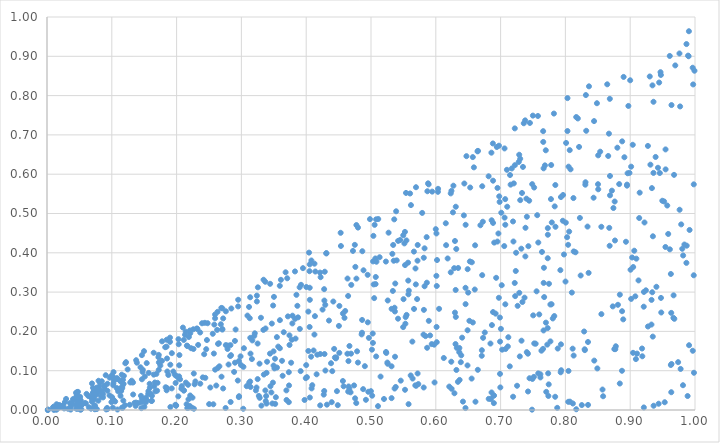
| Category | Series 0 |
|---|---|
| 0.3346108674601953 | 0.09 |
| 0.05352242350241687 | 0.014 |
| 0.5534597976284928 | 0.236 |
| 0.5317183482084774 | 0.111 |
| 0.1903210896777161 | 0.115 |
| 0.33089036839729535 | 0.011 |
| 0.8688505103767908 | 0.546 |
| 0.7452546820998992 | 0.73 |
| 0.06917112646794843 | 0.021 |
| 0.2756167941514921 | 0.005 |
| 0.6440267286544568 | 0.576 |
| 0.7379051768808673 | 0.737 |
| 0.7638807591230342 | 0.402 |
| 0.7767996350791615 | 0.268 |
| 0.4750461932757427 | 0.42 |
| 0.7728488679648859 | 0.463 |
| 0.8764765675516968 | 0.431 |
| 0.36099183500792764 | 0.331 |
| 0.21404311870427417 | 0.199 |
| 0.7503273426919902 | 0.241 |
| 0.7076103797195853 | 0.155 |
| 0.28874953400416126 | 0.097 |
| 0.7102221696329708 | 0.517 |
| 0.48554497341873804 | 0.192 |
| 0.40000535338526166 | 0.114 |
| 0.14502385615050828 | 0.036 |
| 0.10801182653357566 | 0.081 |
| 0.08887011389820587 | 0.061 |
| 0.5525502741835562 | 0.369 |
| 0.2759823668447141 | 0.165 |
| 0.6984901692536842 | 0.529 |
| 0.3135005705194994 | 0.072 |
| 0.5448834085459722 | 0.433 |
| 0.3254471000695862 | 0.312 |
| 0.5364431527887821 | 0.055 |
| 0.5026529940240385 | 0.195 |
| 0.18980605247481352 | 0.173 |
| 0.2520189142857697 | 0.057 |
| 0.5229774536222315 | 0.378 |
| 0.7720877123474915 | 0.166 |
| 0.6815310873353209 | 0.595 |
| 0.3140698255886434 | 0.143 |
| 0.25668766766772366 | 0.015 |
| 0.807969169061331 | 0.612 |
| 0.8348644246009912 | 0.173 |
| 0.42863525859736384 | 0.352 |
| 0.7357933734504685 | 0.73 |
| 0.6014857508311492 | 0.316 |
| 0.6295805628481282 | 0.43 |
| 0.4127074046963689 | 0.192 |
| 0.8687974933848747 | 0.595 |
| 0.016193580050385403 | 0.003 |
| 0.7734061494011968 | 0.093 |
| 0.8223721792858856 | 0.489 |
| 0.693147044667837 | 0.336 |
| 0.2693339442553647 | 0.085 |
| 0.24789275377386466 | 0.221 |
| 0.3396074651293717 | 0.123 |
| 0.1329568423176004 | 0.039 |
| 0.6241386443175346 | 0.558 |
| 0.9971828159755123 | 0.828 |
| 0.698943614575877 | 0.235 |
| 0.7555310068969805 | 0.302 |
| 0.9495555914309505 | 0.532 |
| 0.66439674406568 | 0.658 |
| 0.35320405201272886 | 0.033 |
| 0.5318162392922988 | 0.257 |
| 0.04763531543346444 | 0.016 |
| 0.9139381554840821 | 0.488 |
| 0.5662200003032491 | 0.403 |
| 0.16879869147976856 | 0.092 |
| 0.4601823043992782 | 0.252 |
| 0.15395891471243783 | 0.025 |
| 0.08839976914608849 | 0.061 |
| 0.8503079732271913 | 0.575 |
| 0.060035234266528015 | 0.017 |
| 0.9637316013801825 | 0.776 |
| 0.20389268005652916 | 0.086 |
| 0.9983906198800435 | 0.095 |
| 0.1846596538501677 | 0.05 |
| 0.7576030530566901 | 0.748 |
| 0.504902317282808 | 0.285 |
| 0.12849740909507212 | 0.07 |
| 0.3767345171277898 | 0.12 |
| 0.19042410293573497 | 0.008 |
| 0.9340331604435197 | 0.3 |
| 0.6978968799988595 | 0.544 |
| 0.9348439020989773 | 0.187 |
| 0.18571148756945755 | 0.098 |
| 0.9586694091960357 | 0.448 |
| 0.8898568319406016 | 0.848 |
| 0.8044204465735395 | 0.021 |
| 0.18452103582684065 | 0.161 |
| 0.6050641351763347 | 0.257 |
| 0.6419111249500232 | 0.021 |
| 0.5579963890541367 | 0.015 |
| 0.04698793316015737 | 0.013 |
| 0.31403259321766686 | 0.059 |
| 0.01779842356155792 | 0.01 |
| 0.12771209080975632 | 0.013 |
| 0.06101372591285115 | 0.041 |
| 0.4311469771108004 | 0.398 |
| 0.33759004283976013 | 0.023 |
| 0.21110312939465692 | 0.178 |
| 0.17740730206572575 | 0.125 |
| 0.586619256022279 | 0.158 |
| 0.19722674297732423 | 0.09 |
| 0.07951650747205918 | 0.074 |
| 0.13277120982577084 | 0.07 |
| 0.40561892542504274 | 0.28 |
| 0.2901183885171108 | 0.12 |
| 0.03237670098469325 | 0.003 |
| 0.545909435913267 | 0.075 |
| 0.6709217431536874 | 0.138 |
| 0.9242327263661472 | 0.305 |
| 0.03657654509042607 | 0.001 |
| 0.6123339965580286 | 0.132 |
| 0.8874575709243631 | 0.251 |
| 0.7119147092910484 | 0.185 |
| 0.5496426736973106 | 0.211 |
| 0.7191590135716516 | 0.48 |
| 0.8111804608546319 | 0.156 |
| 0.22672782822487325 | 0.003 |
| 0.05834147562303327 | 0.018 |
| 0.4635692268523869 | 0.143 |
| 0.4775147646395327 | 0.334 |
| 0.4738921275811693 | 0.063 |
| 0.16994959409797616 | 0.049 |
| 0.06460776801639412 | 0.007 |
| 0.3039149127324404 | 0.157 |
| 0.8210879840684617 | 0.669 |
| 0.2625422366803255 | 0.204 |
| 0.7072884242140443 | 0.269 |
| 0.24570359567641342 | 0.155 |
| 0.283985727817767 | 0.139 |
| 0.04479932886188531 | 0.044 |
| 0.08453218717133237 | 0.073 |
| 0.7446626607208486 | 0.081 |
| 0.8777915084539658 | 0.162 |
| 0.4310153925666711 | 0.399 |
| 0.523173517713173 | 0.148 |
| 0.11775899285279612 | 0.024 |
| 0.11672905821339397 | 0.005 |
| 0.734518777658452 | 0.619 |
| 0.4075836271201221 | 0.136 |
| 0.10341135404660717 | 0.075 |
| 0.10251548363526808 | 0.068 |
| 0.09273866786664275 | 0.005 |
| 0.1706177101041928 | 0.069 |
| 0.04015244075538871 | 0.028 |
| 0.874091006845517 | 0.514 |
| 0.5530733983445877 | 0.22 |
| 0.5502090642672399 | 0.282 |
| 0.8554578828078264 | 0.466 |
| 0.7737183199681025 | 0.036 |
| 0.7746631404606942 | 0.321 |
| 0.150743413433579 | 0.028 |
| 0.04507094080891272 | 0.003 |
| 0.11614062248875578 | 0.056 |
| 0.0679297757649866 | 0.003 |
| 0.3233414363651771 | 0.057 |
| 0.5337368113404856 | 0.303 |
| 0.16197024735877152 | 0.036 |
| 0.9457037392064594 | 0.603 |
| 0.203265926667886 | 0.167 |
| 0.2718186403412032 | 0.055 |
| 0.9046007133234849 | 0.364 |
| 0.38358663634354107 | 0.182 |
| 0.9128401970803447 | 0.33 |
| 0.99920308042453 | 0.863 |
| 0.29638901264533735 | 0.035 |
| 0.9078890120466971 | 0.289 |
| 0.14971670626120992 | 0.15 |
| 0.21768746296583597 | 0.064 |
| 0.7742627253252317 | 0.065 |
| 0.5070735840257541 | 0.32 |
| 0.7777317197918483 | 0.537 |
| 0.22099862744260468 | 0.037 |
| 0.1474764860891874 | 0.097 |
| 0.8235860808380364 | 0.342 |
| 0.2443185872404352 | 0.082 |
| 0.10271200658387736 | 0.096 |
| 0.21652478704551958 | 0.005 |
| 0.07410963243889568 | 0.011 |
| 0.09321027799422998 | 0.067 |
| 0.11447066562209773 | 0.048 |
| 0.6019227755371487 | 0.382 |
| 0.09644682726922427 | 0.037 |
| 0.8167060353222642 | 0.745 |
| 0.3549011173519794 | 0.108 |
| 0.525252181947084 | 0.121 |
| 0.9676778185375495 | 0.598 |
| 0.5663919293598269 | 0.257 |
| 0.039176853437448145 | 0.018 |
| 0.3950000344198993 | 0.361 |
| 0.5891937886310323 | 0.227 |
| 0.706168432765699 | 0.489 |
| 0.1478123525470394 | 0.102 |
| 0.7658145639106968 | 0.682 |
| 0.48617430702655584 | 0.197 |
| 0.2260596129921797 | 0.155 |
| 0.45046973584953276 | 0.214 |
| 0.428271566284646 | 0.142 |
| 0.2690455599948076 | 0.26 |
| 0.6458687305571571 | 0.311 |
| 0.029478461435804126 | 0.028 |
| 0.7336804439738099 | 0.275 |
| 0.5317653371916797 | 0.03 |
| 0.8999677709181403 | 0.839 |
| 0.13089121690823435 | 0.071 |
| 0.6974750298444514 | 0.673 |
| 0.5612726444771213 | 0.088 |
| 0.2631846939134942 | 0.25 |
| 0.4905234352871559 | 0.112 |
| 0.6208132492756525 | 0.06 |
| 0.9545559489248203 | 0.663 |
| 0.3238575979781577 | 0.291 |
| 0.7141564107484991 | 0.111 |
| 0.6344825359941587 | 0.361 |
| 0.27053546544478735 | 0.206 |
| 0.966964943687408 | 0.292 |
| 0.10154221983539002 | 0.084 |
| 0.7296304700446326 | 0.136 |
| 0.7072537657187722 | 0.471 |
| 0.7218081560722641 | 0.323 |
| 0.6861742689058107 | 0.483 |
| 0.7519177846335513 | 0.169 |
| 0.2682455354364919 | 0.218 |
| 0.29604115610414605 | 0.033 |
| 0.09992048177773816 | 0.088 |
| 0.6990861175731197 | 0.092 |
| 0.34412351194567925 | 0.143 |
| 0.6011928657225452 | 0.211 |
| 0.6755576430796074 | 0.197 |
| 0.8289075652812822 | 0.2 |
| 0.4056473633897554 | 0.032 |
| 0.14110797231383287 | 0.018 |
| 0.8127350292739425 | 0.138 |
| 0.8676890878614224 | 0.463 |
| 0.983660507419022 | 0.421 |
| 0.6304297182086346 | 0.168 |
| 0.096650987943258 | 0.082 |
| 0.623049500077229 | 0.551 |
| 0.4474500386209518 | 0.048 |
| 0.895981784477592 | 0.602 |
| 0.35186397197595576 | 0.13 |
| 0.9908409575390604 | 0.165 |
| 0.7805126417309334 | 0.233 |
| 0.8581988060390584 | 0.035 |
| 0.6458163842963545 | 0.005 |
| 0.7203728926946875 | 0.577 |
| 0.6571095300439564 | 0.644 |
| 0.598086354549956 | 0.07 |
| 0.7541039731203554 | 0.169 |
| 0.8971964150835033 | 0.774 |
| 0.6432877913501014 | 0.495 |
| 0.11448384744951101 | 0.072 |
| 0.403315652982965 | 0.15 |
| 0.5602829593432465 | 0.551 |
| 0.5616627395757675 | 0.521 |
| 0.2706012302140103 | 0.205 |
| 0.9335148358610847 | 0.565 |
| 0.5870051935862495 | 0.557 |
| 0.336835898065159 | 0.326 |
| 0.477474650958989 | 0.471 |
| 0.689419985829239 | 0.037 |
| 0.4393873959125665 | 0.02 |
| 0.8486747273831797 | 0.781 |
| 0.6014745821248263 | 0.173 |
| 0.199263226064607 | 0.012 |
| 0.7487934654692651 | 0.575 |
| 0.18522700973614592 | 0.131 |
| 0.19806092517164076 | 0.013 |
| 0.7844718445140593 | 0.572 |
| 0.14428745620870176 | 0.109 |
| 0.11538020539961769 | 0.09 |
| 0.5858865859655162 | 0.44 |
| 0.7596565223827024 | 0.243 |
| 0.5729942967875739 | 0.066 |
| 0.1022977706478354 | 0.063 |
| 0.5374422879906802 | 0.322 |
| 0.3387969383101802 | 0.016 |
| 0.6843486094455709 | 0.169 |
| 0.3339384351467517 | 0.204 |
| 0.28019047782109996 | 0.116 |
| 0.9350433145427061 | 0.442 |
| 0.3653599698157345 | 0.198 |
| 0.30935718300790704 | 0.24 |
| 0.7070802943998075 | 0.537 |
| 0.6159307453479878 | 0.419 |
| 0.4721599709122559 | 0.405 |
| 0.7172650077655861 | 0.615 |
| 0.5370692516568552 | 0.135 |
| 0.42804060286588086 | 0.278 |
| 0.1719439766343085 | 0.134 |
| 0.20262040533656855 | 0.035 |
| 0.23654592318129608 | 0.067 |
| 0.014444040878316522 | 0.001 |
| 0.47546027878950503 | 0.03 |
| 0.31289259421881066 | 0.234 |
| 0.6729557988065795 | 0.184 |
| 0.2332467949643522 | 0.166 |
| 0.3731749409720553 | 0.02 |
| 0.19246850352601208 | 0.055 |
| 0.39746579731501397 | 0.026 |
| 0.7441064240499877 | 0.533 |
| 0.019571709144174165 | 0.008 |
| 0.11721402723689123 | 0.077 |
| 0.6816559635091938 | 0.028 |
| 0.6283762360871404 | 0.361 |
| 0.5546788150221155 | 0.432 |
| 0.27603708081276734 | 0.251 |
| 0.5523772183502219 | 0.453 |
| 0.9544011444639978 | 0.415 |
| 0.4054196343044393 | 0.311 |
| 0.503689546285895 | 0.443 |
| 0.2183318851779248 | 0.027 |
| 0.4083544439051625 | 0.055 |
| 0.5697424740907451 | 0.062 |
| 0.5694421941960282 | 0.567 |
| 0.3521601223919537 | 0.016 |
| 0.27859890442175517 | 0.155 |
| 0.6650822885297046 | 0.659 |
| 0.5571912524018551 | 0.375 |
| 0.38987429158277176 | 0.312 |
| 0.7630201157084854 | 0.151 |
| 0.5358625754752661 | 0.485 |
| 0.568648461279238 | 0.36 |
| 0.8026188434877682 | 0.44 |
| 0.6009947223761507 | 0.449 |
| 0.7010761963171656 | 0.502 |
| 0.9146384454310735 | 0.553 |
| 0.684908313006746 | 0.028 |
| 0.7319639852807629 | 0.41 |
| 0.048353539169850634 | 0.023 |
| 0.12085096720473176 | 0.119 |
| 0.9328033237519519 | 0.217 |
| 0.08373234181878442 | 0.034 |
| 0.5880981215959713 | 0.577 |
| 0.7288593522682508 | 0.298 |
| 0.15650127289282012 | 0.048 |
| 0.9473537389156222 | 0.852 |
| 0.6648371993307448 | 0.102 |
| 0.8555344944550406 | 0.244 |
| 0.4566363257974184 | 0.074 |
| 0.7704645044802227 | 0.046 |
| 0.7060712002306675 | 0.666 |
| 0.47992509881693524 | 0.464 |
| 0.2581998235079449 | 0.217 |
| 0.6715980140907564 | 0.343 |
| 0.2205238755078538 | 0.202 |
| 0.24679138918222487 | 0.178 |
| 0.17247066216435858 | 0.14 |
| 0.40529024937440017 | 0.211 |
| 0.7263094405035001 | 0.265 |
| 0.4319786691303532 | 0.014 |
| 0.01038389793696437 | 0.008 |
| 0.5514967044620632 | 0.424 |
| 0.04598232858869444 | 0.039 |
| 0.4462936064854077 | 0.134 |
| 0.696616544443875 | 0.449 |
| 0.830748699639343 | 0.573 |
| 0.8042010248188626 | 0.42 |
| 0.4296329383411873 | 0.1 |
| 0.8645499007292995 | 0.829 |
| 0.9211919735809885 | 0.3 |
| 0.4044008980264262 | 0.4 |
| 0.9633313794558009 | 0.247 |
| 0.9479404021478821 | 0.248 |
| 0.3717851834664089 | 0.238 |
| 0.07039904096595706 | 0.041 |
| 0.07680080414184431 | 0.057 |
| 0.3372815732108244 | 0.207 |
| 0.25937958524639526 | 0.233 |
| 0.025134400603229468 | 0.012 |
| 0.9906027117916839 | 0.964 |
| 0.49504742403126367 | 0.223 |
| 0.9981129618309935 | 0.574 |
| 0.3250444176544426 | 0.169 |
| 0.6901843670260835 | 0.426 |
| 0.33882141377327857 | 0.095 |
| 0.5841649015426135 | 0.188 |
| 0.02305050229983252 | 0.01 |
| 0.010722312648628995 | 0 |
| 0.5717917128819902 | 0.38 |
| 0.646059025472072 | 0.471 |
| 0.7097255266325383 | 0.611 |
| 0.6318102348159734 | 0.102 |
| 0.0471344943664852 | 0.003 |
| 0.1749314574160088 | 0.113 |
| 0.9361363499229681 | 0.011 |
| 0.8671832525839387 | 0.703 |
| 0.6530909036630824 | 0.566 |
| 0.20741570025127498 | 0.054 |
| 0.051096812531314484 | 0.024 |
| 0.014763408083621865 | 0.015 |
| 0.07104234468054049 | 0.045 |
| 0.12446368686644194 | 0.103 |
| 0.1898542426545764 | 0.184 |
| 0.3496470350384522 | 0.113 |
| 0.8445554071762388 | 0.126 |
| 0.06782674809559897 | 0.032 |
| 0.30820259968414476 | 0.061 |
| 0.08300811576173017 | 0.048 |
| 0.7485098097037448 | 0.001 |
| 0.16101741755753274 | 0.023 |
| 0.3341646693230751 | 0.331 |
| 0.0013217988614614429 | 0 |
| 0.2950287914162739 | 0.28 |
| 0.6951929614098528 | 0.565 |
| 0.8950994970423661 | 0.574 |
| 0.6883258990262916 | 0.249 |
| 0.8934364022747038 | 0.428 |
| 0.3135680198478621 | 0.287 |
| 0.17262542196882413 | 0.121 |
| 0.07252490435562386 | 0.05 |
| 0.04201838083357656 | 0.027 |
| 0.13738875034888343 | 0.019 |
| 0.7922227480503726 | 0.356 |
| 0.37351183141981315 | 0.063 |
| 0.1097974246328357 | 0.047 |
| 0.3509947091442406 | 0.106 |
| 0.83103754856041 | 0.58 |
| 0.04778652604722278 | 0.046 |
| 0.6490406646972449 | 0.203 |
| 0.15627951567212361 | 0.041 |
| 0.9916405555592436 | 0.458 |
| 0.6489265899288724 | 0.113 |
| 0.26522453848753813 | 0.17 |
| 0.7154878375853839 | 0.573 |
| 0.4351410668650928 | 0.228 |
| 0.8840164177855853 | 0.293 |
| 0.32694130229684093 | 0.036 |
| 0.9209002036831756 | 0.263 |
| 0.6491441852214962 | 0.358 |
| 0.3777519170812521 | 0.179 |
| 0.08882821100789995 | 0.054 |
| 0.9886028341923533 | 0.036 |
| 0.11822845632875778 | 0.066 |
| 0.4252564893605739 | 0.256 |
| 0.409331602433329 | 0.063 |
| 0.688098940408861 | 0.678 |
| 0.0015419748315429471 | 0.001 |
| 0.50180229175458 | 0.036 |
| 0.64995945440965 | 0.299 |
| 0.5720732672743947 | 0.42 |
| 0.9893272717524363 | 0.902 |
| 0.7279558407805682 | 0.631 |
| 0.0733011156597334 | 0.034 |
| 0.6287540628984074 | 0.043 |
| 0.7684285842438122 | 0.622 |
| 0.9901074051692473 | 0.9 |
| 0.4080158973036877 | 0.38 |
| 0.47724680604305847 | 0.018 |
| 0.47586103745745467 | 0.364 |
| 0.627171020140259 | 0.571 |
| 0.08643629412590637 | 0.032 |
| 0.37418546226030847 | 0.19 |
| 0.2206263129816166 | 0.01 |
| 0.2949748030664512 | 0.264 |
| 0.7580759388975021 | 0.093 |
| 0.783483677976217 | 0.518 |
| 0.19496619802794624 | 0.098 |
| 0.20977892239697327 | 0.21 |
| 0.052774194639987226 | 0.011 |
| 0.3826958619821109 | 0.353 |
| 0.8031968911893512 | 0.71 |
| 0.8839441801879415 | 0.067 |
| 0.28272186082700457 | 0.137 |
| 0.3827987264806644 | 0.232 |
| 0.7790142507936405 | 0.477 |
| 0.3706936888854654 | 0.335 |
| 0.8115479839767017 | 0.017 |
| 0.4957985974912109 | 0.046 |
| 0.5711626021488062 | 0.282 |
| 0.749082674445191 | 0.079 |
| 0.8191852204314517 | 0.742 |
| 0.5418304730324991 | 0.43 |
| 0.7697467610230012 | 0.661 |
| 0.369428702842411 | 0.05 |
| 0.8988810901396123 | 0.603 |
| 0.9043957987486163 | 0.145 |
| 0.7145980638844199 | 0.598 |
| 0.2435628456257508 | 0.222 |
| 0.9311974993720351 | 0.624 |
| 0.2706100714691376 | 0.259 |
| 0.8801924823589602 | 0.667 |
| 0.4418320881532115 | 0.276 |
| 0.5257603252137135 | 0.118 |
| 0.22584927521747622 | 0.205 |
| 0.31688771302277297 | 0.177 |
| 0.4141066890839894 | 0.352 |
| 0.21667827745462043 | 0.163 |
| 0.7004801091155521 | 0.207 |
| 0.07923526950696569 | 0.024 |
| 0.14598823349230683 | 0.02 |
| 0.4294286540406531 | 0.268 |
| 0.9627417577399229 | 0.114 |
| 0.1646751101371806 | 0.146 |
| 0.7421824775421714 | 0.143 |
| 0.5111607805036964 | 0.486 |
| 0.8731326185960794 | 0.264 |
| 0.6973326912109882 | 0.286 |
| 0.4442510556810465 | 0.134 |
| 0.2558503026731028 | 0.194 |
| 0.7768911153796795 | 0.175 |
| 0.1724060497500779 | 0.102 |
| 0.28443602524917044 | 0.258 |
| 0.7664551471200538 | 0.323 |
| 0.08635182185210977 | 0.04 |
| 0.688339108745704 | 0.476 |
| 0.34774455388656267 | 0.017 |
| 0.29002428622614607 | 0.176 |
| 0.37888764272206266 | 0.24 |
| 0.3731790897617764 | 0.096 |
| 0.10211539640009926 | 0.027 |
| 0.3547497615845929 | 0.185 |
| 0.5549169672352298 | 0.242 |
| 0.40512791967738004 | 0.353 |
| 0.7581687270704588 | 0.426 |
| 0.31178615048404024 | 0.262 |
| 0.5055971648008437 | 0.471 |
| 0.26336534691771685 | 0.107 |
| 0.9088033015376796 | 0.13 |
| 0.6553122423878966 | 0.08 |
| 0.6518305544835211 | 0.227 |
| 0.6923425320769254 | 0.245 |
| 0.3486243703527091 | 0.07 |
| 0.9210218628419308 | 0.006 |
| 0.5999758359743363 | 0.46 |
| 0.701729566528495 | 0.318 |
| 0.4652026470948014 | 0.124 |
| 0.8492909141958307 | 0.106 |
| 0.12036120071844492 | 0.012 |
| 0.07296102700499907 | 0.012 |
| 0.49488069780190647 | 0.344 |
| 0.36824159911466925 | 0.35 |
| 0.9039586878649528 | 0.675 |
| 0.901473737019871 | 0.283 |
| 0.6711138795907433 | 0.152 |
| 0.053013559764559015 | 0.002 |
| 0.009148395734810966 | 0.006 |
| 0.2833935376291754 | 0.02 |
| 0.2830736024661984 | 0.165 |
| 0.6341522173946265 | 0.072 |
| 0.9301794564576166 | 0.849 |
| 0.8830360142083232 | 0.575 |
| 0.9680973051045386 | 0.232 |
| 0.6032956560749207 | 0.555 |
| 0.5029788090736951 | 0.171 |
| 0.7786606590047558 | 0.269 |
| 0.34960791709348915 | 0.149 |
| 0.8167610289587725 | 0.002 |
| 0.4998869598189737 | 0.048 |
| 0.11295057471197267 | 0.054 |
| 0.6316057623768401 | 0.41 |
| 0.21431262860004063 | 0.07 |
| 0.6587760485541426 | 0.617 |
| 0.369674355344914 | 0.025 |
| 0.46916668753165025 | 0.143 |
| 0.22450996328859207 | 0.031 |
| 0.6363934681207407 | 0.158 |
| 0.014068658506241505 | 0.004 |
| 0.4127650057510861 | 0.372 |
| 0.3636479114400203 | 0.087 |
| 0.5862118006240006 | 0.324 |
| 0.08196473488441813 | 0.07 |
| 0.9359448712419282 | 0.784 |
| 0.37426209543499844 | 0.165 |
| 0.549777548834328 | 0.445 |
| 0.30312806887917587 | 0.11 |
| 0.50320486547231 | 0.378 |
| 0.3137389205195833 | 0.184 |
| 0.8572776356852144 | 0.052 |
| 0.8315978984555384 | 0.801 |
| 0.07786279834726184 | 0.041 |
| 0.20540331616527407 | 0.078 |
| 0.1872269498615009 | 0.089 |
| 0.8358255417000476 | 0.349 |
| 0.8341419264747033 | 0.467 |
| 0.09329441684067019 | 0.049 |
| 0.525846461118336 | 0.279 |
| 0.7302624790860378 | 0.639 |
| 0.6716743934085038 | 0.569 |
| 0.8048843914216789 | 0.619 |
| 0.5575034765141409 | 0.329 |
| 0.9438674599673239 | 0.016 |
| 0.05205250247656801 | 0.025 |
| 0.10581353856384923 | 0.08 |
| 0.7656641696880518 | 0.71 |
| 0.942833580090444 | 0.616 |
| 0.8755179348596516 | 0.155 |
| 0.16718903763957438 | 0.047 |
| 0.49670391926356616 | 0.184 |
| 0.9273202989531961 | 0.672 |
| 0.8660649166929042 | 0.646 |
| 0.8032211534884864 | 0.794 |
| 0.1077051328630605 | 0.056 |
| 0.7322795871834964 | 0.176 |
| 0.9612189110846853 | 0.409 |
| 0.9343688753406572 | 0.826 |
| 0.8001770212886303 | 0.327 |
| 0.7729071767151822 | 0.446 |
| 0.017629030803465562 | 0.012 |
| 0.0932721617424227 | 0.002 |
| 0.7219023165759487 | 0.717 |
| 0.46663211225056256 | 0.054 |
| 0.0768890774775769 | 0.002 |
| 0.7238949097168528 | 0.4 |
| 0.7963501892504207 | 0.547 |
| 0.2960899166117006 | 0.125 |
| 0.9274170231338162 | 0.212 |
| 0.5889555811380047 | 0.574 |
| 0.8058292544549943 | 0.454 |
| 0.7977806030221143 | 0.396 |
| 0.15100260715903113 | 0.085 |
| 0.019721734149100945 | 0.012 |
| 0.10053470038573198 | 0.033 |
| 0.32067059388863317 | 0.195 |
| 0.49842124891973405 | 0.486 |
| 0.45119483900799906 | 0.265 |
| 0.3120396030496555 | 0.07 |
| 0.03677494528952241 | 0.017 |
| 0.7369548922539976 | 0.286 |
| 0.7699288741549238 | 0.222 |
| 0.9770378463228188 | 0.772 |
| 0.23218113868918544 | 0.206 |
| 0.31987117517351193 | 0.189 |
| 0.2313375616782456 | 0.208 |
| 0.35925632035744426 | 0.316 |
| 0.08276617693432409 | 0.049 |
| 0.5583505620760851 | 0.304 |
| 0.7219935867149888 | 0.623 |
| 0.8537146685146252 | 0.657 |
| 0.8363876073382841 | 0.824 |
| 0.9787235930862459 | 0.472 |
| 0.7663013354850041 | 0.202 |
| 0.6525552011994636 | 0.378 |
| 0.04845631824369745 | 0.021 |
| 0.6472701979422426 | 0.646 |
| 0.47851006428472587 | 0.149 |
| 0.58267050344884 | 0.315 |
| 0.2639226817360806 | 0.168 |
| 0.15270591692282998 | 0.031 |
| 0.5826600769178898 | 0.411 |
| 0.4222557531807313 | 0.338 |
| 0.7931422146276363 | 0.167 |
| 0.8099565492694747 | 0.299 |
| 0.479814956984279 | 0.121 |
| 0.7198162356926461 | 0.429 |
| 0.5200519671902379 | 0.028 |
| 0.07369732394418849 | 0.002 |
| 0.7727221749827999 | 0.386 |
| 0.3873395301761354 | 0.236 |
| 0.9014337312575397 | 0.619 |
| 0.22109562375338432 | 0.195 |
| 0.850675697445199 | 0.562 |
| 0.09940234701232642 | 0.02 |
| 0.5944637066801703 | 0.556 |
| 0.702392276245207 | 0.154 |
| 0.21300093767187478 | 0.191 |
| 0.018340102859458196 | 0.007 |
| 0.7927380819880162 | 0.096 |
| 0.13868518435815969 | 0.12 |
| 0.5133226695989802 | 0.389 |
| 0.35690918374028147 | 0.161 |
| 0.7254115865106494 | 0.062 |
| 0.08075567713544285 | 0.06 |
| 0.7423066285678004 | 0.047 |
| 0.793136987889077 | 0.542 |
| 0.9475018402797716 | 0.285 |
| 0.30283414589164137 | 0.003 |
| 0.868298541092175 | 0.418 |
| 0.04779162771384948 | 0.022 |
| 0.05163990067828084 | 0.001 |
| 0.41708701666587766 | 0.141 |
| 0.4216287592803829 | 0.143 |
| 0.3223912157077552 | 0.05 |
| 0.4001883649897432 | 0.313 |
| 0.9778188658380377 | 0.104 |
| 0.09063872852194643 | 0.088 |
| 0.21106394133831585 | 0.049 |
| 0.14651401452063129 | 0.078 |
| 0.22898828262996374 | 0.073 |
| 0.04631129746364415 | 0.045 |
| 0.538180654996307 | 0.059 |
| 0.14646845880164683 | 0.14 |
| 0.4277087849548409 | 0.307 |
| 0.8349228694647561 | 0.013 |
| 0.5789820189664391 | 0.502 |
| 0.8770035764306452 | 0.155 |
| 0.0913938594729311 | 0.001 |
| 0.16478720505711064 | 0.09 |
| 0.6009086278522537 | 0.341 |
| 0.5084053554314082 | 0.377 |
| 0.07259524874391343 | 0.027 |
| 0.1028824757540554 | 0.08 |
| 0.5816285581710965 | 0.255 |
| 0.5147770679982683 | 0.085 |
| 0.6035064302316387 | 0.563 |
| 0.909506182677272 | 0.385 |
| 0.34895324823099894 | 0.266 |
| 0.8321272759419095 | 0.71 |
| 0.981462590835719 | 0.063 |
| 0.5577370366546628 | 0.294 |
| 0.33014415333614966 | 0.235 |
| 0.7234016433535748 | 0.354 |
| 0.6306565009498529 | 0.305 |
| 0.15868990880857547 | 0.057 |
| 0.4216025541439339 | 0.012 |
| 0.11239281818238644 | 0.075 |
| 0.8123982073119589 | 0.539 |
| 0.9447020836624649 | 0.833 |
| 0.19850147252027284 | 0.069 |
| 0.23635342061427234 | 0.197 |
| 0.46956204462173834 | 0.318 |
| 0.9637731423657508 | 0.117 |
| 0.4535800435111499 | 0.417 |
| 0.2265061897145697 | 0.093 |
| 0.7302789760230004 | 0.534 |
| 0.48629322247623863 | 0.229 |
| 0.5040690657912196 | 0.32 |
| 0.022238825425039743 | 0.007 |
| 0.17756143588825224 | 0.175 |
| 0.2574993158152079 | 0.144 |
| 0.8950747012165646 | 0.571 |
| 0.8069490336962118 | 0.021 |
| 0.5814575759436481 | 0.387 |
| 0.6459543363227598 | 0.269 |
| 0.5810462441221851 | 0.192 |
| 0.5417131788272492 | 0.232 |
| 0.24043434302587885 | 0.083 |
| 0.440243596454288 | 0.099 |
| 0.45317738607743396 | 0.451 |
| 0.7614552019463418 | 0.083 |
| 0.9633756017622161 | 0.045 |
| 0.46847525204719964 | 0.045 |
| 0.6556272295193618 | 0.376 |
| 0.6995850653523022 | 0.057 |
| 0.7056045322137513 | 0.417 |
| 0.7382152728852304 | 0.391 |
| 0.6941904477435078 | 0.669 |
| 0.19964117100131828 | 0.086 |
| 0.6895898349194766 | 0.018 |
| 0.43830829762792 | 0.119 |
| 0.5073570180075443 | 0.338 |
| 0.7111458151405216 | 0.162 |
| 0.45778736999102043 | 0.06 |
| 0.3993562872026656 | 0.081 |
| 0.2593460976665809 | 0.243 |
| 0.9105149514794684 | 0.143 |
| 0.10170371397091382 | 0.006 |
| 0.564237383855943 | 0.08 |
| 0.1848839095989151 | 0.056 |
| 0.6308420620405661 | 0.517 |
| 0.7822887277037602 | 0.754 |
| 0.8717856618186903 | 0.558 |
| 0.010278827902591159 | 0.004 |
| 0.3162130966951592 | 0.13 |
| 0.7192861354390844 | 0.034 |
| 0.5271442995528173 | 0.451 |
| 0.9220651065887264 | 0.477 |
| 0.9005440178899061 | 0.357 |
| 0.5540311658422331 | 0.552 |
| 0.986726039932678 | 0.374 |
| 0.4278027528899635 | 0.048 |
| 0.8875892597121487 | 0.684 |
| 0.5638090400318448 | 0.174 |
| 0.8010853559142268 | 0.68 |
| 0.1824518767116513 | 0.16 |
| 0.33822390842990424 | 0.036 |
| 0.9467689592892362 | 0.86 |
| 0.39019728467305304 | 0.206 |
| 0.7960196833475942 | 0.482 |
| 0.403302480803147 | 0.25 |
| 0.6866220417639477 | 0.216 |
| 0.7404395889139836 | 0.147 |
| 0.5396439305924362 | 0.381 |
| 0.6991869334413376 | 0.174 |
| 0.32510095107949755 | 0.079 |
| 0.2392344099588437 | 0.221 |
| 0.7517827314071563 | 0.566 |
| 0.32389691682040056 | 0.276 |
| 0.7874089248214183 | 0.005 |
| 0.8810785035957867 | 0.268 |
| 0.6324039477046746 | 0.158 |
| 0.5691773556062644 | 0.32 |
| 0.9666790776094496 | 0.234 |
| 0.624422655679364 | 0.054 |
| 0.41348791214705827 | 0.239 |
| 0.40547110432705036 | 0.37 |
| 0.32798963111813173 | 0.118 |
| 0.7935574020594507 | 0.101 |
| 0.4648328369004757 | 0.047 |
| 0.7498254119458466 | 0.749 |
| 0.629578948870515 | 0.248 |
| 0.7828457515801673 | 0.239 |
| 0.5351143773579398 | 0.38 |
| 0.7398620842496719 | 0.538 |
| 0.5067230682113782 | 0.386 |
| 0.11610695994949338 | 0.06 |
| 0.9803378868453935 | 0.41 |
| 0.6897039492094198 | 0.037 |
| 0.9695652751189748 | 0.877 |
| 0.2028511655093761 | 0.18 |
| 0.06942614042325645 | 0.068 |
| 0.5235932484114916 | 0.145 |
| 0.876069244825076 | 0.53 |
| 0.5975585445610916 | 0.166 |
| 0.06384172675041 | 0.035 |
| 0.7330387407401855 | 0.552 |
| 0.507986588856014 | 0.136 |
| 0.14558405889529258 | 0.005 |
| 0.9964512295168237 | 0.871 |
| 0.5368871891444241 | 0.251 |
| 0.1376074869285091 | 0.127 |
| 0.6392600283182769 | 0.139 |
| 0.33695841755564215 | 0.05 |
| 0.19268290181091918 | 0.145 |
| 0.6238921962374754 | 0.123 |
| 0.18308451185965235 | 0.058 |
| 0.5363012384056497 | 0.26 |
| 0.9739587465451757 | 0.122 |
| 0.3593601459020861 | 0.157 |
| 0.4270849307706921 | 0.039 |
| 0.7224775427955668 | 0.29 |
| 0.32824838226047626 | 0.031 |
| 0.4160652450874812 | 0.091 |
| 0.6406192714534055 | 0.184 |
| 0.1134953586084465 | 0.036 |
| 0.41136684128201184 | 0.151 |
| 0.21855815059466988 | 0.006 |
| 0.4213807916131067 | 0.35 |
| 0.7881763650649742 | 0.156 |
| 0.5684061423651896 | 0.063 |
| 0.16641701888674187 | 0.07 |
| 0.10221471783639513 | 0.026 |
| 0.8300027130492494 | 0.152 |
| 0.21590082643973763 | 0.164 |
| 0.22774705233977988 | 0.065 |
| 0.46543790101364824 | 0.06 |
| 0.27187153907683403 | 0.233 |
| 0.5108070854532063 | 0.01 |
| 0.2993488895906067 | 0.114 |
| 0.1523577091112116 | 0.019 |
| 0.12195732010112459 | 0.122 |
| 0.2188843461015756 | 0.186 |
| 0.5078739327188878 | 0.485 |
| 0.3920257195442983 | 0.319 |
| 0.34626578093787175 | 0.045 |
| 0.1157584242144335 | 0.006 |
| 0.19912519422744723 | 0.011 |
| 0.4510831618392872 | 0.145 |
| 0.05113748200935342 | 0.033 |
| 0.2660717738060906 | 0.111 |
| 0.02659382249312814 | 0.004 |
| 0.6361831559571225 | 0.147 |
| 0.8873031828725115 | 0.1 |
| 0.9980674217102051 | 0.343 |
| 0.45909901138974085 | 0.234 |
| 0.38638059845690087 | 0.265 |
| 0.9871958382379112 | 0.418 |
| 0.8006350955561511 | 0.477 |
| 0.9532884034024685 | 0.02 |
| 0.8156183014440139 | 0.401 |
| 0.8066750085564839 | 0.661 |
| 0.9182904247733165 | 0.156 |
| 0.5813354226604681 | 0.057 |
| 0.3849306927220487 | 0.293 |
| 0.1052233482870184 | 0.022 |
| 0.7726600843915256 | 0.208 |
| 0.8253438328965121 | 0.013 |
| 0.7668707651022654 | 0.362 |
| 0.35023249484744823 | 0.288 |
| 0.751335912717269 | 0.084 |
| 0.6231053317021917 | 0.35 |
| 0.10878060501285214 | 0.001 |
| 0.34483819602894117 | 0.06 |
| 0.9762486846644114 | 0.51 |
| 0.918695389785957 | 0.137 |
| 0.48662897352405643 | 0.404 |
| 0.9965683015412119 | 0.151 |
| 0.13069839731500743 | 0.075 |
| 0.7672527631272815 | 0.287 |
| 0.3786328065752689 | 0.22 |
| 0.16194673314899077 | 0.023 |
| 0.26124640216372186 | 0.062 |
| 0.7428686333427119 | 0.417 |
| 0.46376300710254714 | 0.334 |
| 0.359433049150507 | 0.229 |
| 0.07092647372091243 | 0.056 |
| 0.6726034060743288 | 0.479 |
| 0.20433422863457185 | 0.14 |
| 0.7405509818400422 | 0.492 |
| 0.4431439028287979 | 0.155 |
| 0.6688200154003727 | 0.47 |
| 0.9610592071930768 | 0.901 |
| 0.756532721102114 | 0.496 |
| 0.940450012020368 | 0.314 |
| 0.5387914614161139 | 0.506 |
| 0.9627344118188267 | 0.346 |
| 0.7614062914830669 | 0.091 |
| 0.29109639286540645 | 0.205 |
| 0.04561408048727278 | 0.034 |
| 0.3443525345214936 | 0.321 |
| 0.03718003386107649 | 0.01 |
| 0.21122955397683407 | 0.05 |
| 0.9546577582293931 | 0.612 |
| 0.16538877673829933 | 0.06 |
| 0.8047742401164636 | 0.099 |
| 0.8505965889667146 | 0.648 |
| 0.501460881741915 | 0.154 |
| 0.4921567882399016 | 0.026 |
| 0.8128179634033221 | 0.403 |
| 0.6154084499620048 | 0.475 |
| 0.6571569563140336 | 0.223 |
| 0.7663557393629641 | 0.615 |
| 0.10933375828119518 | 0.054 |
| 0.48789362758215293 | 0.053 |
| 0.15843985935442317 | 0.067 |
| 0.9359097753325402 | 0.603 |
| 0.8435006648178182 | 0.54 |
| 0.6308888453629377 | 0.237 |
| 0.04488699853218847 | 0.013 |
| 0.9571791807116738 | 0.52 |
| 0.8892455283056127 | 0.231 |
| 0.1570008327267075 | 0.094 |
| 0.3626836777428054 | 0.125 |
| 0.6601169416361078 | 0.307 |
| 0.7780604846036593 | 0.623 |
| 0.9868292762747364 | 0.931 |
| 0.07684521783915021 | 0.049 |
| 0.39145586169847213 | 0.099 |
| 0.7846932393414201 | 0.466 |
| 0.24253113130552084 | 0.142 |
| 0.20805571615511098 | 0.061 |
| 0.22409972659757882 | 0.005 |
| 0.20404617728100505 | 0.114 |
| 0.6386159390905117 | 0.122 |
| 0.6612299792190766 | 0.021 |
| 0.15027856528882866 | 0.008 |
| 0.532937415921032 | 0.397 |
| 0.13501872104027546 | 0.018 |
| 0.0850452772557343 | 0.043 |
| 0.1465601620790732 | 0.029 |
| 0.5912575211577836 | 0.19 |
| 0.11861144721571837 | 0.087 |
| 0.9817058403552346 | 0.393 |
| 0.25946172469003403 | 0.103 |
| 0.44578957323078083 | 0.131 |
| 0.8685598542304706 | 0.792 |
| 0.4487400691705672 | 0.012 |
| 0.6951020528976888 | 0.429 |
| 0.4884564500573694 | 0.355 |
| 0.7842068376365701 | 0.034 |
| 0.7655285425374159 | 0.156 |
| 0.5719510482042033 | 0.093 |
| 0.9029887938550138 | 0.388 |
| 0.5524953482496577 | 0.051 |
| 0.7383963533426408 | 0.464 |
| 0.051922973950923046 | 0.011 |
| 0.5342222074273532 | 0.42 |
| 0.03549184874881939 | 0.017 |
| 0.0012820614245914186 | 0 |
| 0.5937263757159323 | 0.168 |
| 0.8442250565888341 | 0.735 |
| 0.8297244744814587 | 0.154 |
| 0.6883645504817543 | 0.583 |
| 0.2987119122490286 | 0.136 |
| 0.10856655452749331 | 0.079 |
| 0.7287137884572205 | 0.649 |
| 0.21543523444214352 | 0.015 |
| 0.9523398995629071 | 0.531 |
| 0.02763214325426333 | 0.02 |
| 0.2944493940680206 | 0.075 |
| 0.46674695576830927 | 0.163 |
| 0.13673303639711742 | 0.01 |
| 0.4646978957524137 | 0.29 |
| 0.401122565059995 | 0.084 |
| 0.01256842642731626 | 0.006 |
| 0.8910349099209796 | 0.643 |
| 0.6858223215438046 | 0.655 |
| 0.4566428660427474 | 0.246 |
| 0.1846776433568913 | 0.179 |
| 0.6606801473523742 | 0.419 |
| 0.22242129037627 | 0.157 |
| 0.6860523312588912 | 0.045 |
| 0.2788658863914455 | 0.164 |
| 0.626447619808138 | 0.503 |
| 0.15387358303957466 | 0.119 |
| 0.16020785950191807 | 0.041 |
| 0.9062742606317625 | 0.405 |
| 0.9329317108847458 | 0.28 |
| 0.939231127811382 | 0.644 |
| 0.2502185326203821 | 0.015 |
| 0.9760049453381313 | 0.907 |
| 0.6367717521289005 | 0.077 |
| 0.20355567255813334 | 0.081 |
| 0.6182909027012045 | 0.386 |
| 0.34695578929581783 | 0.22 |